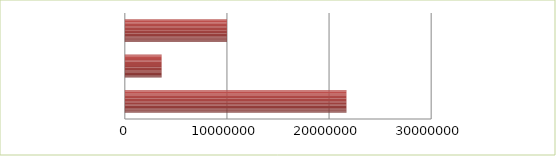
| Category | Series 0 | Series 1 |
|---|---|---|
| 0 | 2.5 | 21702951 |
| 1 | 2.6 | 3602000 |
| 2 | 2.7 | 10000000 |